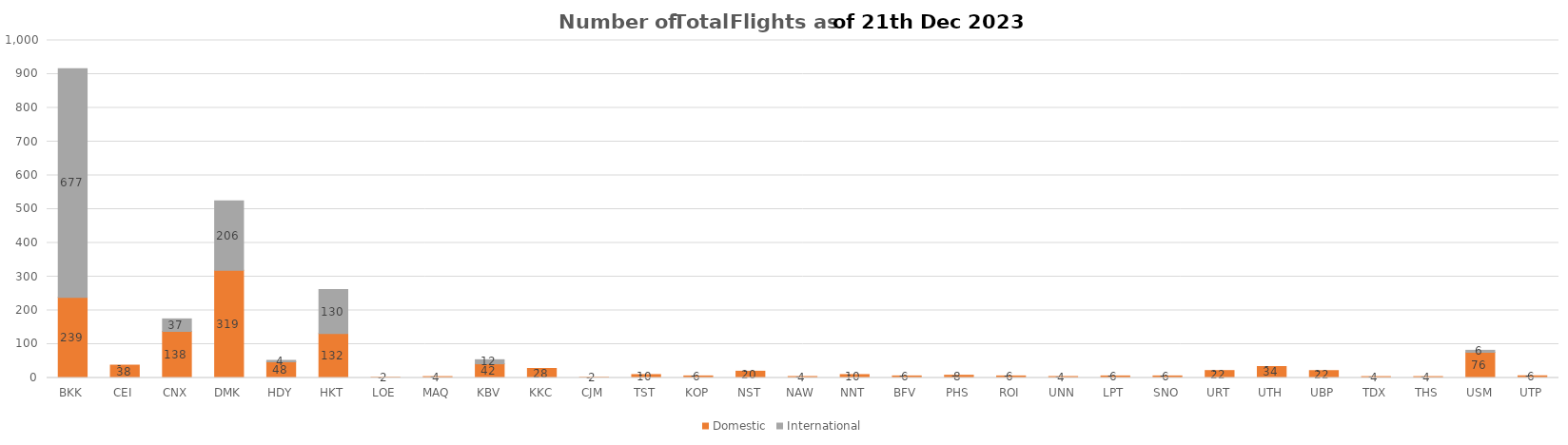
| Category | Domestic | International |
|---|---|---|
| BKK | 239 | 677 |
| CEI | 38 | 0 |
| CNX | 138 | 37 |
| DMK | 319 | 206 |
| HDY | 48 | 4 |
| HKT | 132 | 130 |
| LOE | 2 | 0 |
| MAQ | 4 | 0 |
| KBV | 42 | 12 |
| KKC | 28 | 0 |
| CJM | 2 | 0 |
| TST | 10 | 0 |
| KOP | 6 | 0 |
| NST | 20 | 0 |
| NAW | 4 | 0 |
| NNT | 10 | 0 |
| BFV | 6 | 0 |
| PHS | 8 | 0 |
| ROI | 6 | 0 |
| UNN | 4 | 0 |
| LPT | 6 | 0 |
| SNO | 6 | 0 |
| URT | 22 | 0 |
| UTH | 34 | 0 |
| UBP | 22 | 0 |
| TDX | 4 | 0 |
| THS | 4 | 0 |
| USM | 76 | 6 |
| UTP | 6 | 0 |